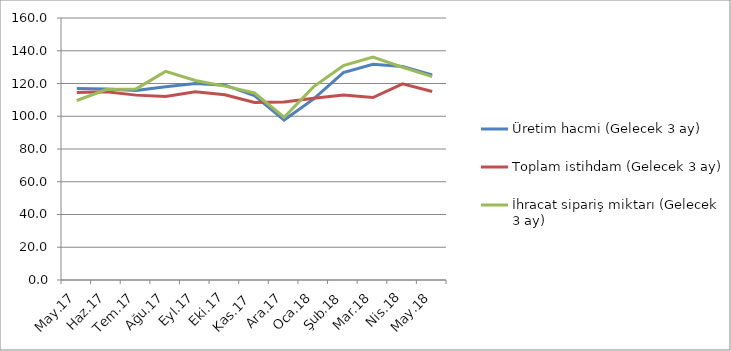
| Category | Üretim hacmi (Gelecek 3 ay) | Toplam istihdam (Gelecek 3 ay) | İhracat sipariş miktarı (Gelecek 3 ay) |
|---|---|---|---|
| May.17 | 116.9 | 114.5 | 109.6 |
| Haz.17 | 116.6 | 114.9 | 116.3 |
| Tem.17 | 115.8 | 112.9 | 116.7 |
| Ağu.17 | 118 | 112.1 | 127.4 |
| Eyl.17 | 120 | 115 | 121.8 |
| Eki.17 | 119 | 113.1 | 118.4 |
| Kas.17 | 112.6 | 108.4 | 114.2 |
| Ara.17 | 97.7 | 108.7 | 99.4 |
| Oca.18 | 110.6 | 111 | 118.1 |
| Şub.18 | 126.7 | 113 | 130.9 |
| Mar.18 | 131.7 | 111.4 | 136.1 |
| Nis.18 | 130.4 | 119.8 | 129.9 |
| May.18 | 125.3 | 115.1 | 124.2 |